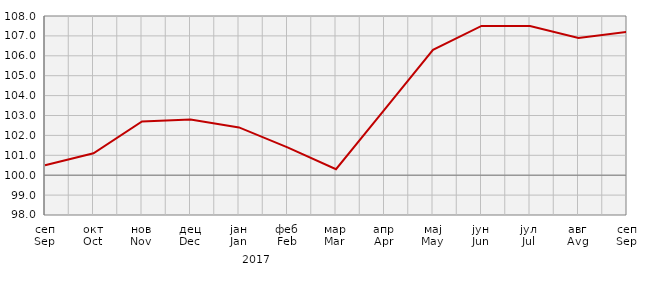
| Category | Индекси цијена произвођача
Producer price indices |
|---|---|
| сеп
Sep | 100.5 |
| окт
Oct | 101.1 |
| нов
Nov | 102.7 |
| дец
Dec | 102.8 |
| јан
Jan | 102.4 |
| феб
Feb | 101.4 |
| мар
Mar | 100.3 |
| апр
Apr | 103.3 |
| мај
May | 106.3 |
| јун
Jun | 107.5 |
| јул
Jul | 107.5 |
| авг
Avg | 106.9 |
| сеп
Sep | 107.2 |